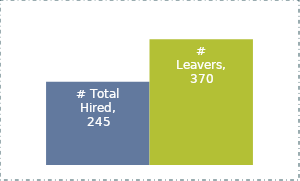
| Category | # Total Hired | # Leavers |
|---|---|---|
| 0 | 245 | 370 |